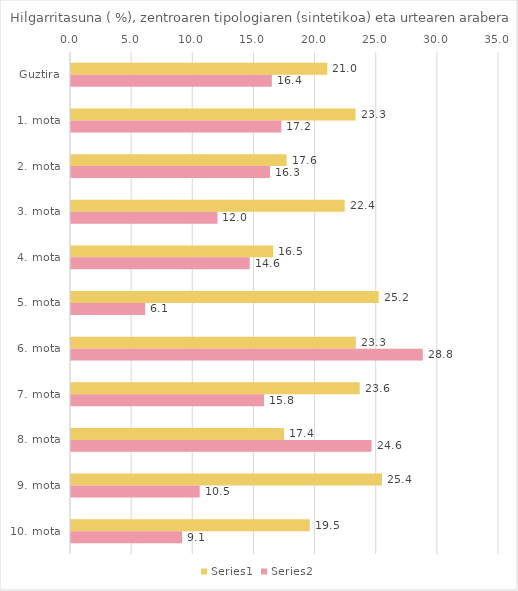
| Category | Series 0 | Series 1 |
|---|---|---|
| Guztira | 20.957 | 16.427 |
| 1. mota | 23.27 | 17.199 |
| 2. mota | 17.631 | 16.272 |
| 3. mota | 22.379 | 11.979 |
| 4. mota | 16.532 | 14.612 |
| 5. mota | 25.161 | 6.061 |
| 6. mota | 23.293 | 28.767 |
| 7. mota | 23.611 | 15.789 |
| 8. mota | 17.429 | 24.576 |
| 9. mota | 25.434 | 10.526 |
| 10. mota | 19.521 | 9.091 |